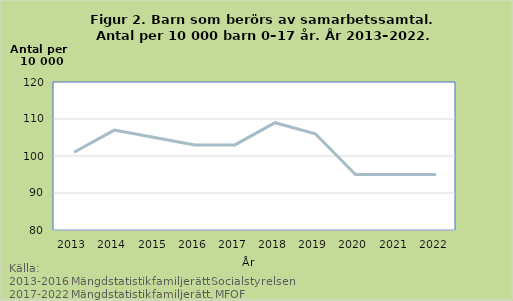
| Category | Samarbetssamtal |
|---|---|
| 2013.0 | 101 |
| 2014.0 | 107 |
| 2015.0 | 105 |
| 2016.0 | 103 |
| 2017.0 | 103 |
| 2018.0 | 109 |
| 2019.0 | 106 |
| 2020.0 | 95 |
| 2021.0 | 95 |
| 2022.0 | 95 |